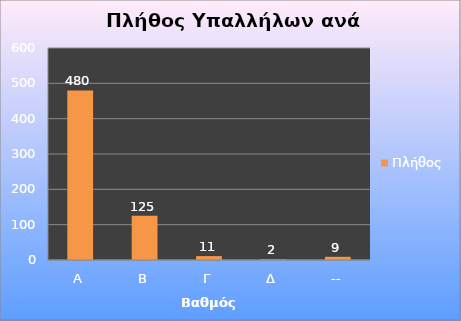
| Category | Πλήθος |
|---|---|
| Α | 480 |
| Β | 125 |
| Γ | 11 |
| Δ | 2 |
| -- | 9 |